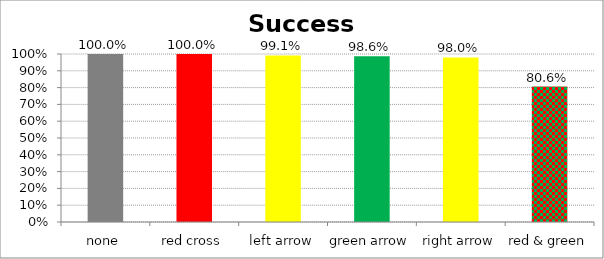
| Category | Success Rate |
|---|---|
| none | 1 |
| red cross | 1 |
| left arrow | 0.991 |
| green arrow | 0.986 |
| right arrow | 0.98 |
| red & green | 0.806 |